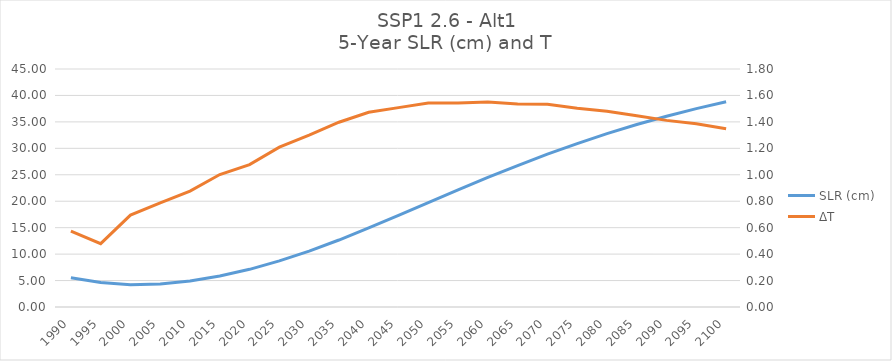
| Category | SLR (cm) |
|---|---|
| 1990.0 | 5.549 |
| 1995.0 | 4.625 |
| 2000.0 | 4.219 |
| 2005.0 | 4.353 |
| 2010.0 | 4.915 |
| 2015.0 | 5.869 |
| 2020.0 | 7.122 |
| 2025.0 | 8.712 |
| 2030.0 | 10.562 |
| 2035.0 | 12.664 |
| 2040.0 | 14.956 |
| 2045.0 | 17.328 |
| 2050.0 | 19.757 |
| 2055.0 | 22.146 |
| 2060.0 | 24.493 |
| 2065.0 | 26.735 |
| 2070.0 | 28.895 |
| 2075.0 | 30.907 |
| 2080.0 | 32.785 |
| 2085.0 | 34.507 |
| 2090.0 | 36.071 |
| 2095.0 | 37.509 |
| 2100.0 | 38.794 |